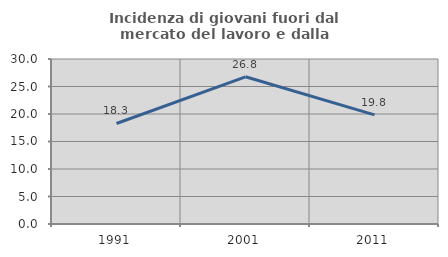
| Category | Incidenza di giovani fuori dal mercato del lavoro e dalla formazione  |
|---|---|
| 1991.0 | 18.278 |
| 2001.0 | 26.761 |
| 2011.0 | 19.84 |